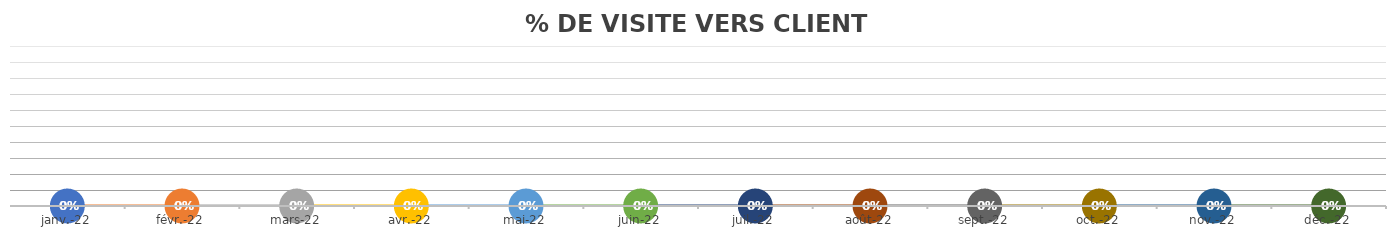
| Category | % DE VISITE VERS CLIENT POTENTIEL |
|---|---|
| 2022-01-18 | 0 |
| 2022-02-18 | 0 |
| 2022-03-18 | 0 |
| 2022-04-18 | 0 |
| 2022-05-18 | 0 |
| 2022-06-18 | 0 |
| 2022-07-18 | 0 |
| 2022-08-18 | 0 |
| 2022-09-18 | 0 |
| 2022-10-18 | 0 |
| 2022-11-18 | 0 |
| 2022-12-18 | 0 |